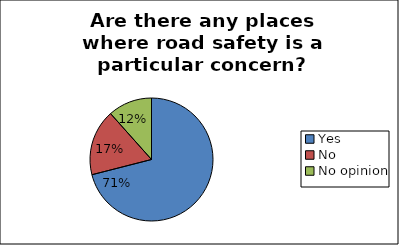
| Category | Series 0 |
|---|---|
| Yes | 0.71 |
| No | 0.174 |
| No opinion | 0.116 |